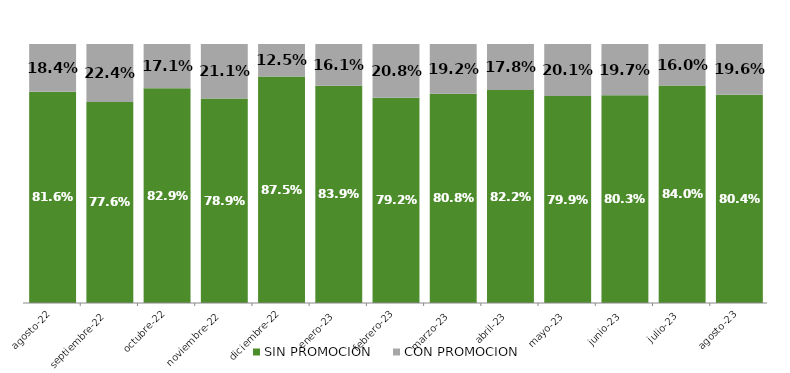
| Category | SIN PROMOCION   | CON PROMOCION   |
|---|---|---|
| 2022-08-01 | 0.816 | 0.184 |
| 2022-09-01 | 0.776 | 0.224 |
| 2022-10-01 | 0.829 | 0.171 |
| 2022-11-01 | 0.789 | 0.211 |
| 2022-12-01 | 0.875 | 0.125 |
| 2023-01-01 | 0.839 | 0.161 |
| 2023-02-01 | 0.792 | 0.208 |
| 2023-03-01 | 0.808 | 0.192 |
| 2023-04-01 | 0.822 | 0.178 |
| 2023-05-01 | 0.799 | 0.201 |
| 2023-06-01 | 0.803 | 0.197 |
| 2023-07-01 | 0.84 | 0.16 |
| 2023-08-01 | 0.804 | 0.196 |